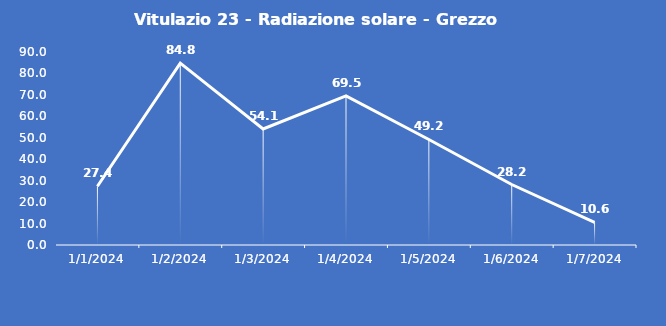
| Category | Vitulazio 23 - Radiazione solare - Grezzo (W/m2) |
|---|---|
| 1/1/24 | 27.4 |
| 1/2/24 | 84.8 |
| 1/3/24 | 54.1 |
| 1/4/24 | 69.5 |
| 1/5/24 | 49.2 |
| 1/6/24 | 28.2 |
| 1/7/24 | 10.6 |